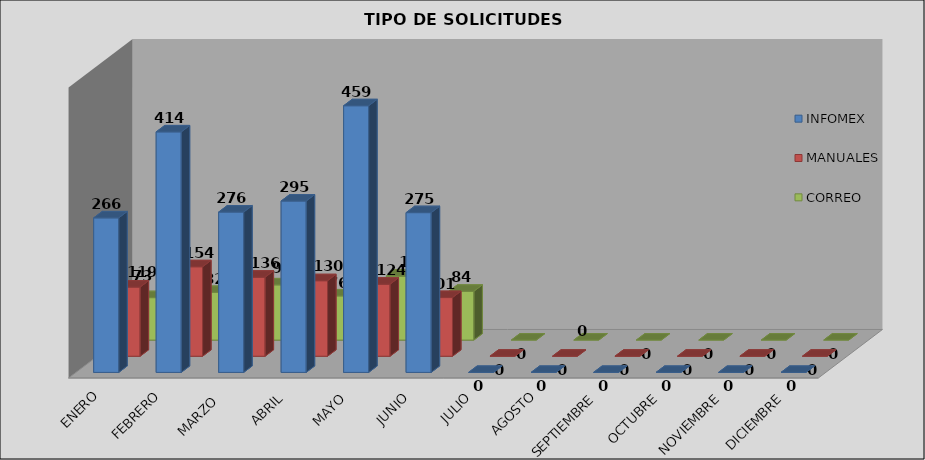
| Category | INFOMEX | MANUALES | CORREO |
|---|---|---|---|
| ENERO | 266 | 119 | 73 |
| FEBRERO | 414 | 154 | 82 |
| MARZO  | 276 | 136 | 95 |
| ABRIL | 295 | 130 | 76 |
| MAYO | 459 | 124 | 110 |
| JUNIO | 275 | 101 | 84 |
| JULIO | 0 | 0 | 0 |
| AGOSTO | 0 | 0 | 0 |
| SEPTIEMBRE | 0 | 0 | 0 |
| OCTUBRE | 0 | 0 | 0 |
| NOVIEMBRE | 0 | 0 | 0 |
| DICIEMBRE | 0 | 0 | 0 |